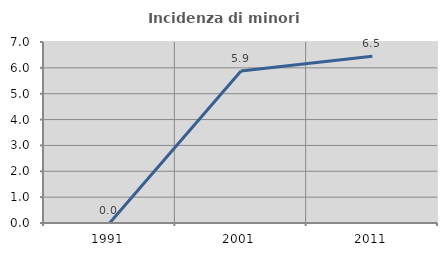
| Category | Incidenza di minori stranieri |
|---|---|
| 1991.0 | 0 |
| 2001.0 | 5.882 |
| 2011.0 | 6.452 |